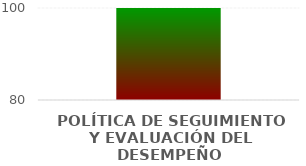
| Category | Niveles |
|---|---|
| POLÍTICA DE SEGUIMIENTO Y EVALUACIÓN DEL DESEMPEÑO INSTITUCIONAL | 100 |